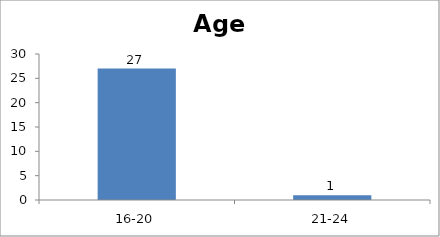
| Category | Age |
|---|---|
| 16-20 | 27 |
| 21-24 | 1 |